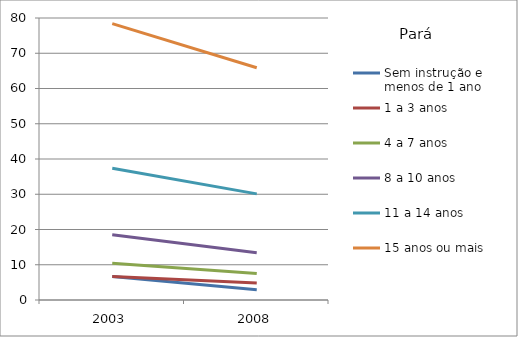
| Category | Sem instrução e menos de 1 ano | 1 a 3 anos | 4 a 7 anos | 8 a 10 anos | 11 a 14 anos | 15 anos ou mais |
|---|---|---|---|---|---|---|
| 2003.0 | 6.7 | 6.7 | 10.4 | 18.5 | 37.4 | 78.4 |
| 2008.0 | 2.9 | 4.8 | 7.5 | 13.4 | 30.1 | 65.9 |